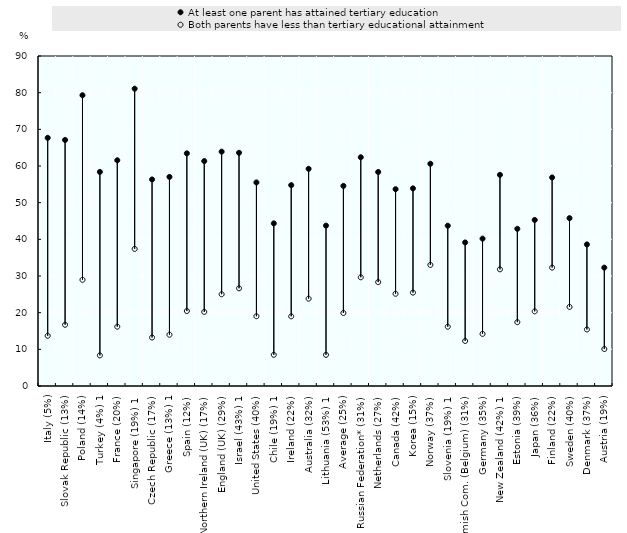
| Category | At least one parent has attained tertiary education | Both parents have less than tertiary educational attainment |
|---|---|---|
| Italy (5%) | 67.683 | 13.7 |
| Slovak Republic (13%) | 67.107 | 16.698 |
| Poland (14%) | 79.299 | 28.969 |
| Turkey (4%) 1 | 58.385 | 8.348 |
| France (20%) | 61.565 | 16.174 |
| Singapore (19%) 1 | 81.079 | 37.394 |
| Czech Republic (17%) | 56.333 | 13.224 |
| Greece (13%) 1 | 57.03 | 13.984 |
| Spain (12%) | 63.452 | 20.447 |
| Northern Ireland (UK) (17%) | 61.346 | 20.213 |
| England (UK) (29%) | 63.912 | 25.019 |
| Israel (43%) 1 | 63.596 | 26.643 |
| United States (40%) | 55.517 | 19.028 |
| Chile (19%) 1 | 44.359 | 8.505 |
| Ireland (22%) | 54.785 | 18.999 |
| Australia (32%) | 59.237 | 23.821 |
| Lithuania (53%) 1 | 43.737 | 8.497 |
| Average (25%) | 54.569 | 19.908 |
| Russian Federation* (31%) | 62.39 | 29.649 |
| Netherlands (27%) | 58.368 | 28.337 |
| Canada (42%) | 53.676 | 25.152 |
| Korea (15%) | 53.9 | 25.469 |
| Norway (37%) | 60.61 | 33.02 |
| Slovenia (19%) 1 | 43.712 | 16.168 |
| Flemish Com. (Belgium) (31%) | 39.151 | 12.29 |
| Germany (35%) | 40.196 | 14.212 |
| New Zealand (42%) 1 | 57.588 | 31.818 |
| Estonia (39%) | 42.87 | 17.412 |
| Japan (36%) | 45.285 | 20.359 |
| Finland (22%) | 56.873 | 32.288 |
| Sweden (40%) | 45.779 | 21.563 |
| Denmark (37%) | 38.611 | 15.41 |
| Austria (19%) | 32.288 | 10.078 |